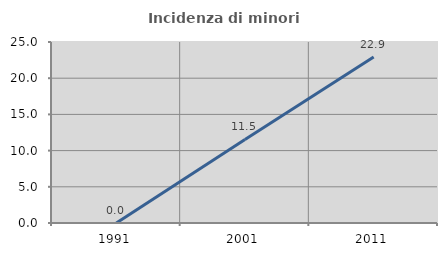
| Category | Incidenza di minori stranieri |
|---|---|
| 1991.0 | 0 |
| 2001.0 | 11.538 |
| 2011.0 | 22.917 |